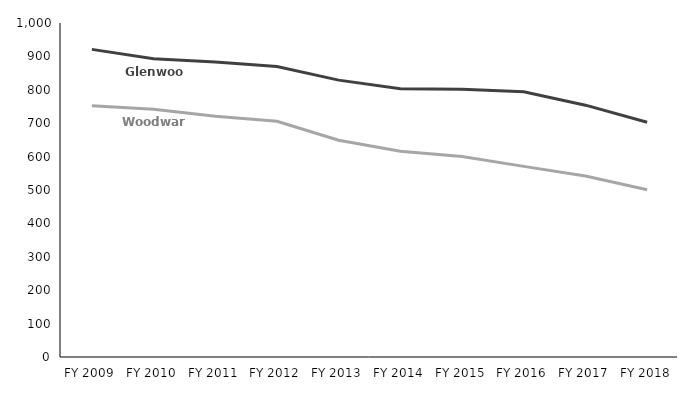
| Category | Glenwood | Woodward |
|---|---|---|
| FY 2009 | 921 | 752 |
| FY 2010 | 893 | 742 |
| FY 2011 | 883 | 721 |
| FY 2012 | 870 | 706 |
| FY 2013 | 829 | 649 |
| FY 2014 | 803 | 616 |
| FY 2015 | 802 | 600 |
| FY 2016 | 793.85 | 570.72 |
| FY 2017 | 754 | 542 |
| FY 2018 | 703 | 501 |